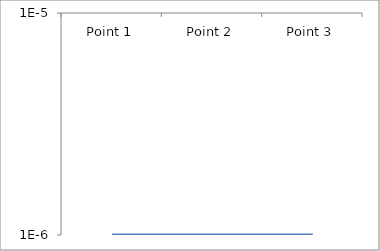
| Category | Series 7 |
|---|---|
| Point 1 | 0 |
| Point 2 | 0 |
| Point 3 | 0 |